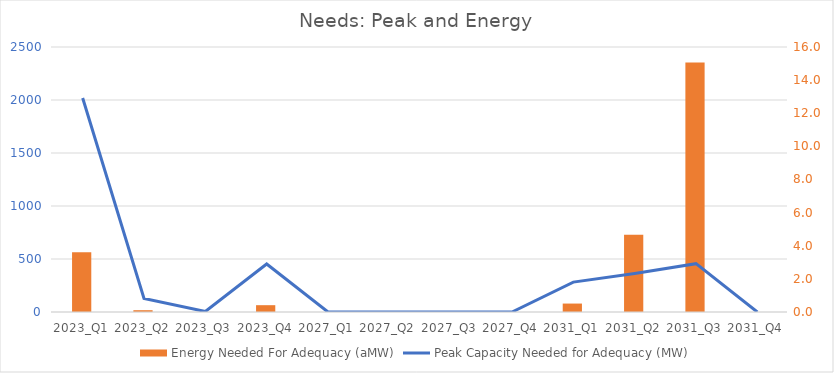
| Category | Energy Needed For Adequacy (aMW) |
|---|---|
| 2023_Q1 | 3.611 |
| 2023_Q2 | 0.108 |
| 2023_Q3 | 0.002 |
| 2023_Q4 | 0.412 |
| 2027_Q1 | 0 |
| 2027_Q2 | 0 |
| 2027_Q3 | 0 |
| 2027_Q4 | 0 |
| 2031_Q1 | 0.51 |
| 2031_Q2 | 4.67 |
| 2031_Q3 | 15.07 |
| 2031_Q4 | 0 |